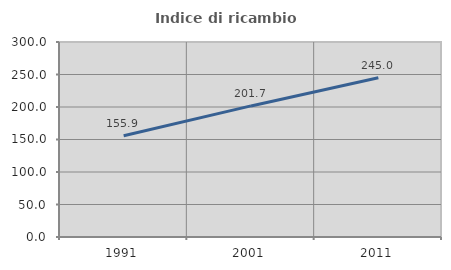
| Category | Indice di ricambio occupazionale  |
|---|---|
| 1991.0 | 155.875 |
| 2001.0 | 201.676 |
| 2011.0 | 245.028 |